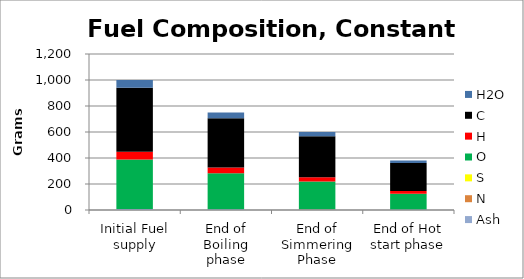
| Category | Ash | N | S | O | H | C | H2O |
|---|---|---|---|---|---|---|---|
| Initial Fuel supply | 7.52 | 0.94 | 0 | 380.7 | 59.22 | 491.62 | 60 |
| End of Boiling phase | 5.712 | 0.82 | 0 | 276.404 | 43.519 | 380.105 | 43.44 |
| End of Simmering Phase | 4.634 | 0.758 | 0 | 212.985 | 34.015 | 314.247 | 33.36 |
| End of Hot start phase | 3.038 | 0.644 | 0 | 121.864 | 20.263 | 215.291 | 18.9 |